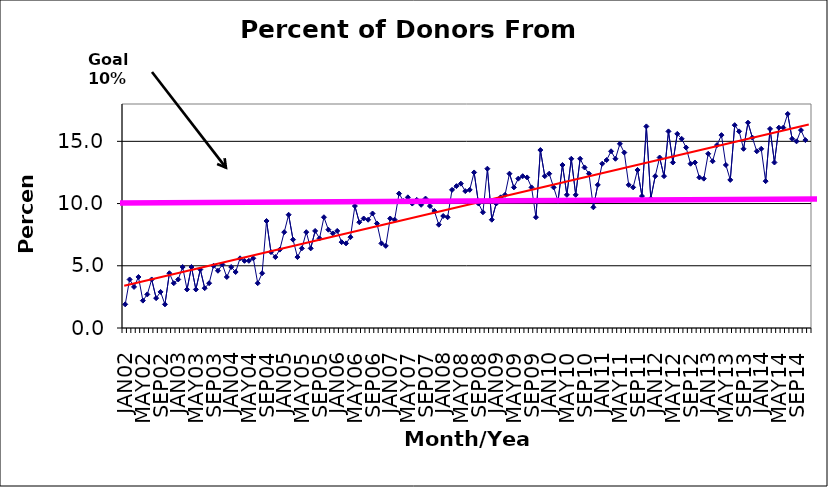
| Category | Series 0 |
|---|---|
| JAN02 | 1.9 |
| FEB02 | 3.9 |
| MAR02 | 3.3 |
| APR02 | 4.1 |
| MAY02 | 2.2 |
| JUN02 | 2.7 |
| JUL02 | 3.9 |
| AUG02 | 2.4 |
| SEP02 | 2.9 |
| OCT02 | 1.9 |
| NOV02 | 4.4 |
| DEC02 | 3.6 |
| JAN03 | 3.9 |
| FEB03 | 4.9 |
| MAR03 | 3.1 |
| APR03 | 4.9 |
| MAY03 | 3.1 |
| JUN03 | 4.7 |
| JUL03 | 3.2 |
| AUG03 | 3.6 |
| SEP03 | 5 |
| OCT03 | 4.6 |
| NOV03 | 5.1 |
| DEC03 | 4.1 |
| JAN04 | 4.9 |
| FEB04 | 4.5 |
| MAR04 | 5.6 |
| APR04 | 5.4 |
| MAY04 | 5.4 |
| JUN04 | 5.6 |
| JUL04 | 3.6 |
| AUG04 | 4.4 |
| SEP04 | 8.6 |
| OCT04 | 6.1 |
| NOV04 | 5.7 |
| DEC04 | 6.3 |
| JAN05 | 7.7 |
| FEB05 | 9.1 |
| MAR05 | 7.1 |
| APR05 | 5.7 |
| MAY05 | 6.4 |
| JUN05 | 7.7 |
| JUL05 | 6.4 |
| AUG05 | 7.8 |
| SEP05 | 7.2 |
| OCT05 | 8.9 |
| NOV05 | 7.9 |
| DEC05 | 7.6 |
| JAN06 | 7.8 |
| FEB06 | 6.9 |
| MAR06 | 6.8 |
| APR06 | 7.3 |
| MAY06 | 9.8 |
| JUN06 | 8.5 |
| JUL06 | 8.8 |
| AUG06 | 8.7 |
| SEP06 | 9.2 |
| OCT06 | 8.4 |
| NOV06 | 6.8 |
| DEC06 | 6.6 |
| JAN07 | 8.8 |
| FEB07 | 8.7 |
| MAR07 | 10.8 |
| APR07 | 10.2 |
| MAY07 | 10.5 |
| JUN07 | 10 |
| JUL07 | 10.3 |
| AUG07 | 9.9 |
| SEP07 | 10.4 |
| OCT07 | 9.8 |
| NOV07 | 9.4 |
| DEC07 | 8.3 |
| JAN08 | 9 |
| FEB08 | 8.9 |
| MAR08 | 11.1 |
| APR08 | 11.4 |
| MAY08 | 11.6 |
| JUN08 | 11 |
| JUL08 | 11.1 |
| AUG08 | 12.5 |
| SEP08 | 10 |
| OCT08 | 9.3 |
| NOV08 | 12.8 |
| DEC08 | 8.7 |
| JAN09 | 10 |
| FEB09 | 10.5 |
| MAR09 | 10.7 |
| APR09 | 12.4 |
| MAY09 | 11.3 |
| JUN09 | 12 |
| JUL09 | 12.2 |
| AUG09 | 12.1 |
| SEP09 | 11.3 |
| OCT09 | 8.9 |
| NOV09 | 14.3 |
| DEC09 | 12.2 |
| JAN10 | 12.4 |
| FEB10 | 11.3 |
| MAR10 | 10.2 |
| APR10 | 13.1 |
| MAY10 | 10.7 |
| JUN10 | 13.6 |
| JUL10 | 10.7 |
| AUG10 | 13.6 |
| SEP10 | 12.9 |
| OCT10 | 12.4 |
| NOV10 | 9.7 |
| DEC10 | 11.5 |
| JAN11 | 13.2 |
| FEB11 | 13.5 |
| MAR11 | 14.2 |
| APR11 | 13.6 |
| MAY11 | 14.8 |
| JUN11 | 14.1 |
| JUL11 | 11.5 |
| AUG11 | 11.3 |
| SEP11 | 12.7 |
| OCT11 | 10.6 |
| NOV11 | 16.2 |
| DEC11 | 10.4 |
| JAN12 | 12.2 |
| FEB12 | 13.7 |
| MAR12 | 12.2 |
| APR12 | 15.8 |
| MAY12 | 13.3 |
| JUN12 | 15.6 |
| JUL12 | 15.2 |
| AUG12 | 14.5 |
| SEP12 | 13.2 |
| OCT12 | 13.3 |
| NOV12 | 12.1 |
| DEC12 | 12 |
| JAN13 | 14 |
| FEB13 | 13.4 |
| MAR13 | 14.7 |
| APR13 | 15.5 |
| MAY13 | 13.1 |
| JUN13 | 11.9 |
| JUL13 | 16.3 |
| AUG13 | 15.8 |
| SEP13 | 14.4 |
| OCT13 | 16.5 |
| NOV13 | 15.3 |
| DEC13 | 14.2 |
| JAN14 | 14.4 |
| FEB14 | 11.8 |
| MAR14 | 16 |
| APR14 | 13.3 |
| MAY14 | 16.1 |
| JUN14 | 16.1 |
| JUL14 | 17.2 |
| AUG14 | 15.2 |
| SEP14 | 15 |
| OCT14 | 15.9 |
| NOV14 | 15.1 |